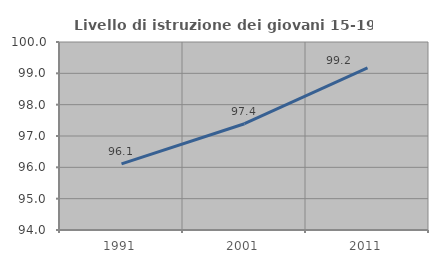
| Category | Livello di istruzione dei giovani 15-19 anni |
|---|---|
| 1991.0 | 96.112 |
| 2001.0 | 97.391 |
| 2011.0 | 99.173 |